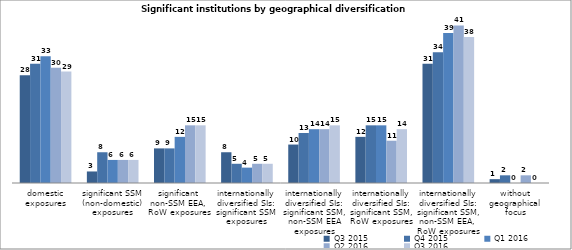
| Category | Q3 2015 | Q4 2015 | Q1 2016 | Q2 2016 | Q3 2016 |
|---|---|---|---|---|---|
| domestic exposures | 28 | 31 | 33 | 30 | 29 |
| significant SSM
(non-domestic) exposures | 3 | 8 | 6 | 6 | 6 |
| significant 
non-SSM EEA, 
RoW exposures | 9 | 9 | 12 | 15 | 15 |
| internationally
diversified SIs:
significant SSM
exposures | 8 | 5 | 4 | 5 | 5 |
| internationally
diversified SIs:
significant SSM,
non-SSM EEA
exposures | 10 | 13 | 14 | 14 | 15 |
| internationally diversified SIs:
significant SSM,
RoW exposures | 12 | 15 | 15 | 11 | 14 |
| internationally diversified SIs:
significant SSM,
non-SSM EEA, 
RoW exposures | 31 | 34 | 39 | 41 | 38 |
| without geographical focus | 1 | 2 | 0 | 2 | 0 |